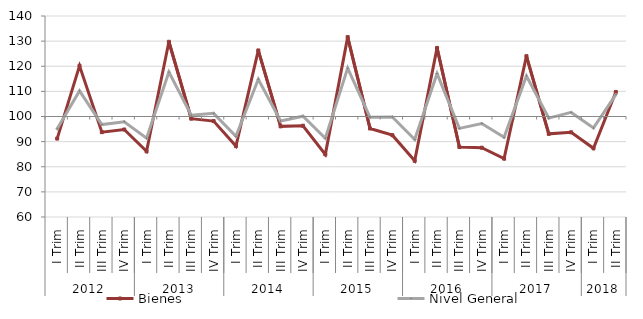
| Category | Bienes | Nivel General |
|---|---|---|
| 0 | 91.213 | 95.089 |
| 1 | 120.181 | 110.192 |
| 2 | 93.775 | 96.803 |
| 3 | 94.832 | 97.916 |
| 4 | 86.14 | 91.37 |
| 5 | 129.743 | 117.668 |
| 6 | 99.129 | 100.523 |
| 7 | 98.173 | 101.255 |
| 8 | 88.215 | 92.144 |
| 9 | 126.295 | 114.823 |
| 10 | 96.073 | 98.199 |
| 11 | 96.322 | 100.116 |
| 12 | 84.926 | 91.36 |
| 13 | 131.598 | 119.245 |
| 14 | 95.24 | 99.67 |
| 15 | 92.571 | 99.815 |
| 16 | 82.356 | 90.83 |
| 17 | 127.31 | 117.073 |
| 18 | 87.851 | 95.27 |
| 19 | 87.58 | 97.176 |
| 20 | 83.222 | 91.717 |
| 21 | 124.017 | 116.141 |
| 22 | 93.102 | 99.353 |
| 23 | 93.701 | 101.623 |
| 24 | 87.333 | 95.441 |
| 25 | 109.774 | 108.7 |